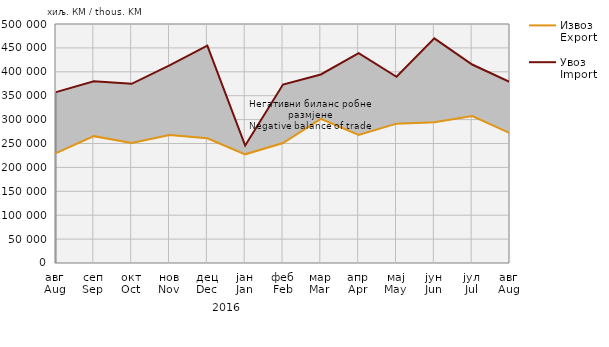
| Category | Извоз
Export | Увоз
Import |
|---|---|---|
| авг
Aug | 229988 | 357450 |
| сеп
Sep | 265387 | 380274 |
| окт
Oct | 250954 | 374802 |
| нов
Nov | 267945 | 413271 |
| дец
Dec | 260835 | 454746 |
| јан
Jan | 227374 | 245836 |
| феб
Feb | 250969 | 373425 |
| мар
Mar | 301409 | 394414 |
| апр
Apr | 267973 | 439226 |
| мај
May | 291497 | 389648 |
| јун
Jun | 294242 | 469944 |
| јул
Jul | 307500 | 415218 |
| авг
Aug | 271563 | 378656 |